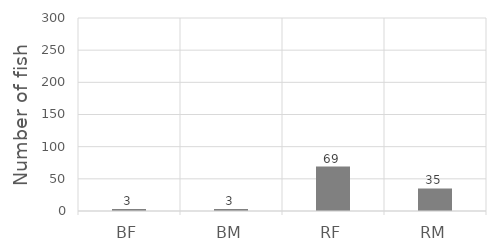
| Category | Series 0 |
|---|---|
| BF | 3 |
| BM | 3 |
| RF | 69 |
| RM | 35 |